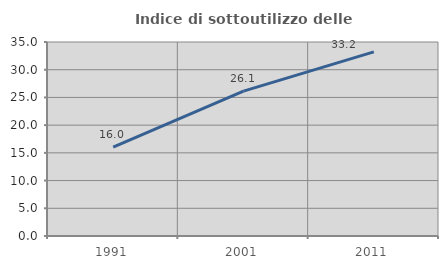
| Category | Indice di sottoutilizzo delle abitazioni  |
|---|---|
| 1991.0 | 16.048 |
| 2001.0 | 26.134 |
| 2011.0 | 33.213 |